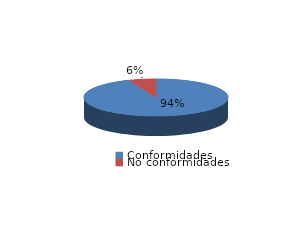
| Category | Series 0 |
|---|---|
| Conformidades | 444 |
| No conformidades | 29 |